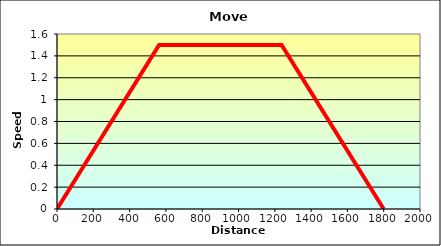
| Category | Series 0 |
|---|---|
| 0.0 | 0 |
| 562.5 | 1.5 |
| 1237.5 | 1.5 |
| 1800.0 | 0 |